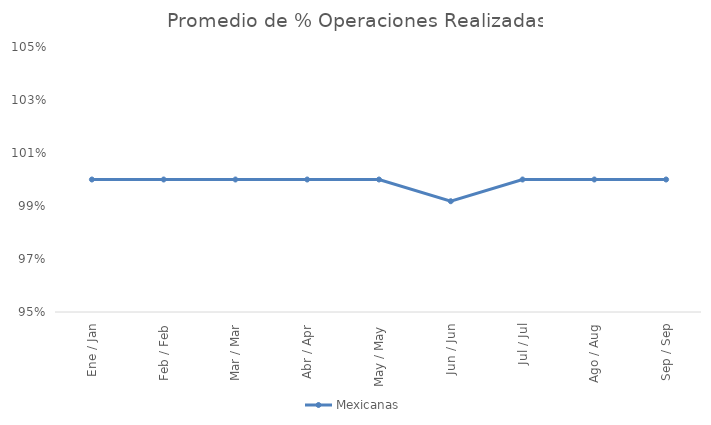
| Category | Mexicanas |
|---|---|
| Ene / Jan | 1 |
| Feb / Feb | 1 |
| Mar / Mar | 1 |
| Abr / Apr | 1 |
| May / May | 1 |
| Jun / Jun | 0.992 |
| Jul / Jul | 1 |
| Ago / Aug | 1 |
| Sep / Sep | 1 |